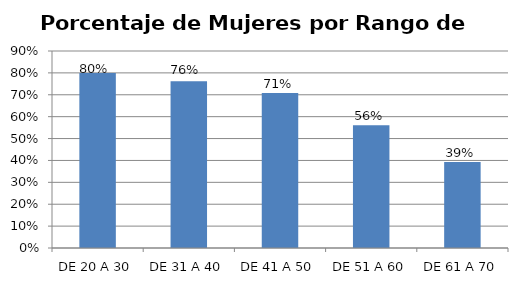
| Category | Porcentaje |
|---|---|
| DE 20 A 30 | 0.8 |
| DE 31 A 40 | 0.762 |
| DE 41 A 50 | 0.708 |
| DE 51 A 60 | 0.561 |
| DE 61 A 70 | 0.393 |